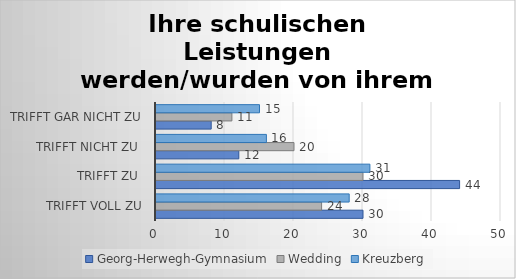
| Category | Georg-Herwegh-Gymnasium | Wedding | Kreuzberg |
|---|---|---|---|
| trifft voll zu | 30 | 24 | 28 |
| trifft zu  | 44 | 30 | 31 |
| trifft nicht zu  | 12 | 20 | 16 |
| trifft gar nicht zu | 8 | 11 | 15 |